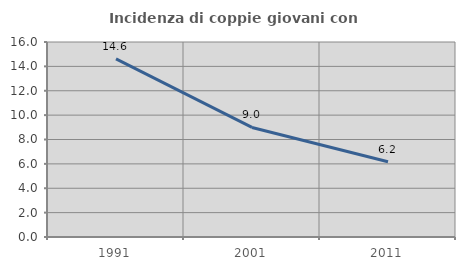
| Category | Incidenza di coppie giovani con figli |
|---|---|
| 1991.0 | 14.619 |
| 2001.0 | 8.989 |
| 2011.0 | 6.176 |